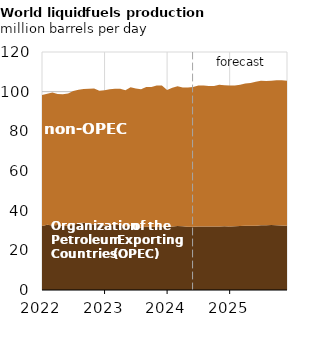
| Category | OPEC Countries | non-OPEC Countries |
|---|---|---|
| 2022-01-01 | 32.234 | 66.031 |
| 2022-02-01 | 32.842 | 66.151 |
| 2022-03-01 | 32.486 | 67.152 |
| 2022-04-01 | 32.73 | 66.048 |
| 2022-05-01 | 32.281 | 66.421 |
| 2022-06-01 | 32.456 | 66.662 |
| 2022-07-01 | 32.768 | 67.573 |
| 2022-08-01 | 33.759 | 67.208 |
| 2022-09-01 | 33.874 | 67.488 |
| 2022-10-01 | 33.446 | 68.059 |
| 2022-11-01 | 33.085 | 68.496 |
| 2022-12-01 | 33.212 | 67.303 |
| 2023-01-01 | 32.58 | 68.087 |
| 2023-02-01 | 32.778 | 68.401 |
| 2023-03-01 | 32.967 | 68.51 |
| 2023-04-01 | 32.861 | 68.629 |
| 2023-05-01 | 32.148 | 68.629 |
| 2023-06-01 | 32.371 | 69.821 |
| 2023-07-01 | 31.548 | 69.998 |
| 2023-08-01 | 31.364 | 69.883 |
| 2023-09-01 | 31.988 | 70.306 |
| 2023-10-01 | 31.854 | 70.537 |
| 2023-11-01 | 31.905 | 71.234 |
| 2023-12-01 | 31.892 | 71.222 |
| 2024-01-01 | 31.804 | 69.042 |
| 2024-02-01 | 32.002 | 69.975 |
| 2024-03-01 | 32.264 | 70.454 |
| 2024-04-01 | 32.138 | 69.959 |
| 2024-05-01 | 31.938 | 70.224 |
| 2024-06-01 | 31.84 | 70.547 |
| 2024-07-01 | 32.015 | 71.037 |
| 2024-08-01 | 32.064 | 71.059 |
| 2024-09-01 | 32.068 | 70.772 |
| 2024-10-01 | 32.061 | 70.822 |
| 2024-11-01 | 31.988 | 71.485 |
| 2024-12-01 | 32.117 | 71.165 |
| 2025-01-01 | 32.044 | 71.107 |
| 2025-02-01 | 32.097 | 70.997 |
| 2025-03-01 | 32.248 | 71.299 |
| 2025-04-01 | 32.345 | 71.732 |
| 2025-05-01 | 32.397 | 72.03 |
| 2025-06-01 | 32.449 | 72.55 |
| 2025-07-01 | 32.646 | 72.89 |
| 2025-08-01 | 32.699 | 72.647 |
| 2025-09-01 | 32.751 | 72.698 |
| 2025-10-01 | 32.643 | 73.118 |
| 2025-11-01 | 32.492 | 73.227 |
| 2025-12-01 | 32.392 | 73.089 |